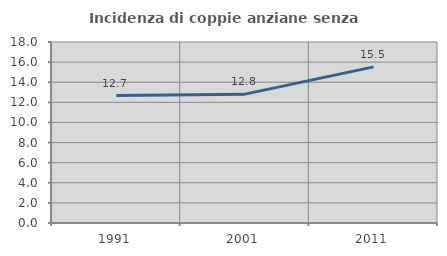
| Category | Incidenza di coppie anziane senza figli  |
|---|---|
| 1991.0 | 12.676 |
| 2001.0 | 12.814 |
| 2011.0 | 15.527 |